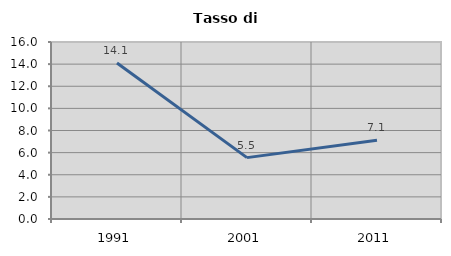
| Category | Tasso di disoccupazione   |
|---|---|
| 1991.0 | 14.108 |
| 2001.0 | 5.549 |
| 2011.0 | 7.127 |